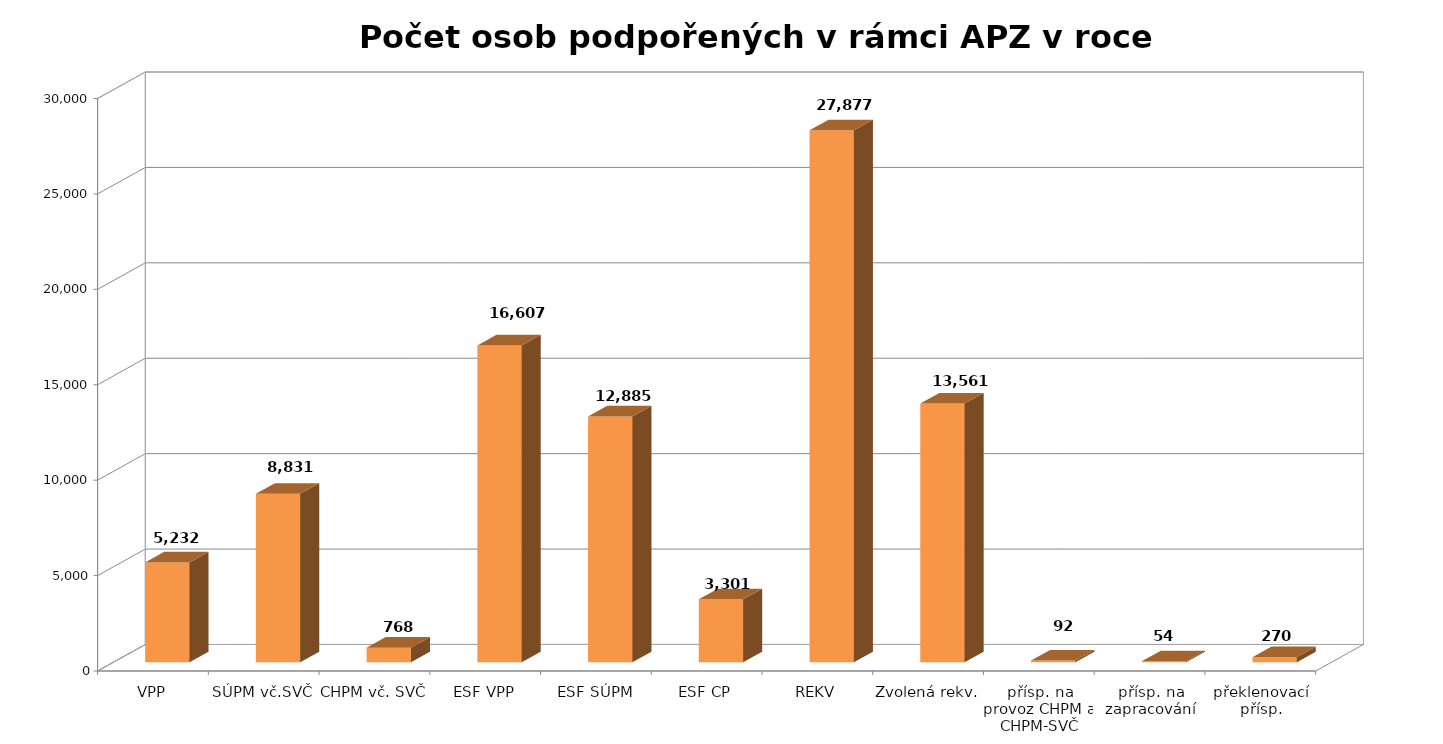
| Category | Series 0 |
|---|---|
| VPP | 5232 |
| SÚPM vč.SVČ | 8831 |
| CHPM vč. SVČ | 768 |
| ESF VPP | 16607 |
| ESF SÚPM | 12885 |
| ESF CP | 3301 |
| REKV | 27877 |
| Zvolená rekv. | 13561 |
| přísp. na provoz CHPM a CHPM-SVČ | 92 |
| přísp. na zapracování | 54 |
| překlenovací přísp. | 270 |